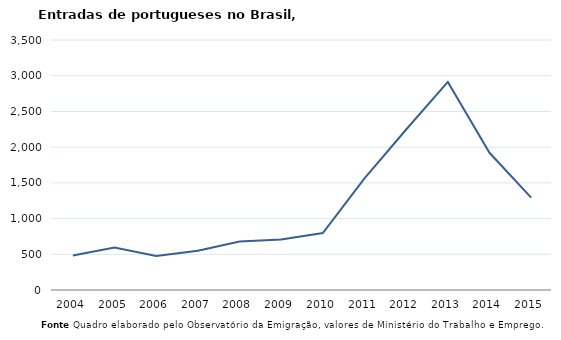
| Category | Entradas |
|---|---|
| 2004.0 | 482 |
| 2005.0 | 595 |
| 2006.0 | 477 |
| 2007.0 | 550 |
| 2008.0 | 679 |
| 2009.0 | 708 |
| 2010.0 | 798 |
| 2011.0 | 1564 |
| 2012.0 | 2247 |
| 2013.0 | 2913 |
| 2014.0 | 1921 |
| 2015.0 | 1294 |